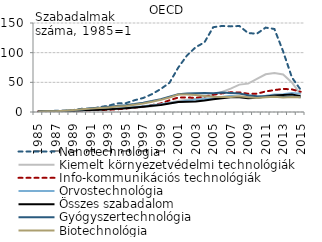
| Category | Nanotechnológia | Kiemelt környezetvédelmi technológiák | Info-kommunikációs technológiák | Orvostechnológia | Összes szabadalom | Gyógyszertechnológia | Biotechnológia |
|---|---|---|---|---|---|---|---|
| 1985.0 | 1 | 1 | 1 | 1 | 1 | 1 | 1 |
| 1986.0 | 1.164 | 1.368 | 1.146 | 1.129 | 1.16 | 1.092 | 1.199 |
| 1987.0 | 2.036 | 1.4 | 1.359 | 1.321 | 1.33 | 1.343 | 1.411 |
| 1988.0 | 2.109 | 1.954 | 1.852 | 1.873 | 1.771 | 2.117 | 2.3 |
| 1989.0 | 3.418 | 2.16 | 2.004 | 2.416 | 2.114 | 2.837 | 3.167 |
| 1990.0 | 5.491 | 3.131 | 2.829 | 2.926 | 2.983 | 4.305 | 4.642 |
| 1991.0 | 5.309 | 3.714 | 3.131 | 3.739 | 3.53 | 6.25 | 5.688 |
| 1992.0 | 8.218 | 4.262 | 3.347 | 4.661 | 3.901 | 7.044 | 6.631 |
| 1993.0 | 10.6 | 4.857 | 3.726 | 5.578 | 4.499 | 8.858 | 7.765 |
| 1994.0 | 14.491 | 5.753 | 4.54 | 6.263 | 5.269 | 10.217 | 9.127 |
| 1995.0 | 14.812 | 6.385 | 5.832 | 7.373 | 6.214 | 11.522 | 10.103 |
| 1996.0 | 19.816 | 7.519 | 7.457 | 8.372 | 7.449 | 13.316 | 12.315 |
| 1997.0 | 23.627 | 8.376 | 9.348 | 9.701 | 8.854 | 15.641 | 14.172 |
| 1998.0 | 30.112 | 9.721 | 11.706 | 11.39 | 10.409 | 18.403 | 17.133 |
| 1999.0 | 38.78 | 12.777 | 14.38 | 12.933 | 11.849 | 21.597 | 20.492 |
| 2000.0 | 49.187 | 16.233 | 19.784 | 15.28 | 14.455 | 25.959 | 24.484 |
| 2001.0 | 74.849 | 18.764 | 24.394 | 17.02 | 16.723 | 30.058 | 29.32 |
| 2002.0 | 95.291 | 20.721 | 24.531 | 18.889 | 17.145 | 30.985 | 29.602 |
| 2003.0 | 109.185 | 22.221 | 23.809 | 20.852 | 17.76 | 31.691 | 28.514 |
| 2004.0 | 117.368 | 24.639 | 26.165 | 21.887 | 19.33 | 32.085 | 27.015 |
| 2005.0 | 142.896 | 29.157 | 29.062 | 23.21 | 21.505 | 31.633 | 25.666 |
| 2006.0 | 145.033 | 33.749 | 31.417 | 25.219 | 23.302 | 32.781 | 25.205 |
| 2007.0 | 144.299 | 39.305 | 33.2 | 27.549 | 24.674 | 31.983 | 25.112 |
| 2008.0 | 144.92 | 46.148 | 32.949 | 25.879 | 24.967 | 31.061 | 26.729 |
| 2009.0 | 132.94 | 47.828 | 30.722 | 25.392 | 23.37 | 28.218 | 24.732 |
| 2010.0 | 132.038 | 55.68 | 30.908 | 26.073 | 23.982 | 26.382 | 23.762 |
| 2011.0 | 142.247 | 63.515 | 34.621 | 27.366 | 26.15 | 25.998 | 24.973 |
| 2012.0 | 139.883 | 65.672 | 36.941 | 29.313 | 27.76 | 25.541 | 25.505 |
| 2013.0 | 102.111 | 63.365 | 38.905 | 30.049 | 28.784 | 25.311 | 24.508 |
| 2014.0 | 58.321 | 49.739 | 38.155 | 32.195 | 29.581 | 26.199 | 25.484 |
| 2015.0 | 37.452 | 29.61 | 34.041 | 30.571 | 26.637 | 24.731 | 24.913 |